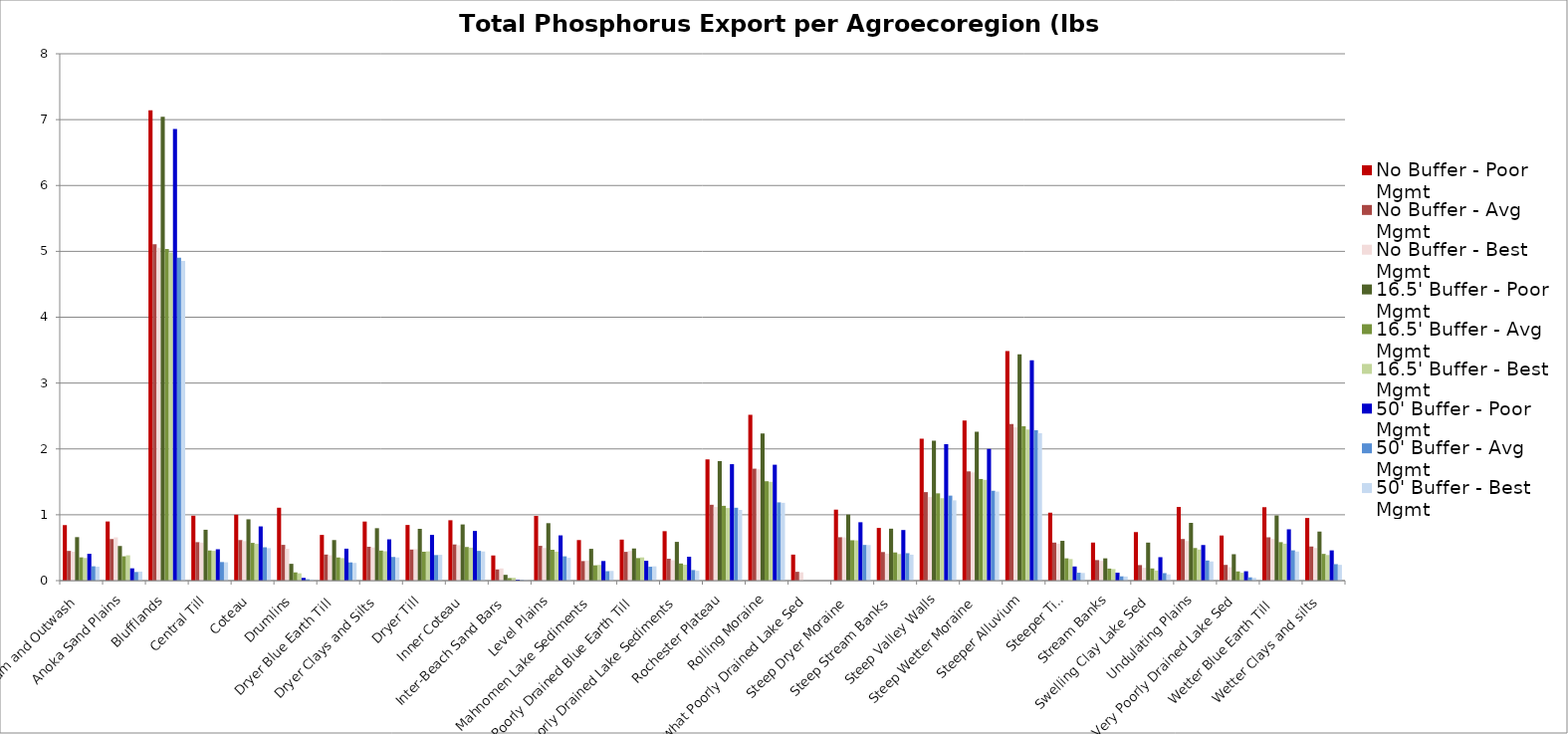
| Category | No Buffer - Poor Mgmt | No Buffer - Avg Mgmt | No Buffer - Best Mgmt | 16.5' Buffer - Poor Mgmt | 16.5' Buffer - Avg Mgmt | 16.5' Buffer - Best Mgmt | 50' Buffer - Poor Mgmt | 50' Buffer - Avg Mgmt | 50' Buffer - Best Mgmt |
|---|---|---|---|---|---|---|---|---|---|
| Alluvium and Outwash | 0.843 | 0.451 | 0.439 | 0.66 | 0.353 | 0.344 | 0.407 | 0.218 | 0.212 |
| Anoka Sand Plains | 0.898 | 0.631 | 0.657 | 0.526 | 0.37 | 0.385 | 0.187 | 0.131 | 0.137 |
| Blufflands | 7.141 | 5.107 | 5.054 | 7.042 | 5.036 | 4.984 | 6.859 | 4.905 | 4.855 |
| Central Till | 0.986 | 0.584 | 0.577 | 0.773 | 0.458 | 0.452 | 0.476 | 0.282 | 0.279 |
| Coteau | 1.001 | 0.616 | 0.6 | 0.931 | 0.573 | 0.558 | 0.823 | 0.507 | 0.494 |
| Drumlins | 1.107 | 0.543 | 0.483 | 0.255 | 0.125 | 0.111 | 0.042 | 0.021 | 0.018 |
| Dryer Blue Earth Till | 0.694 | 0.396 | 0.385 | 0.616 | 0.352 | 0.342 | 0.485 | 0.277 | 0.269 |
| Dryer Clays and Silts | 0.897 | 0.514 | 0.503 | 0.796 | 0.456 | 0.447 | 0.627 | 0.359 | 0.352 |
| Dryer Till | 0.845 | 0.472 | 0.477 | 0.786 | 0.439 | 0.444 | 0.695 | 0.388 | 0.392 |
| Inner Coteau | 0.917 | 0.549 | 0.538 | 0.853 | 0.511 | 0.501 | 0.754 | 0.452 | 0.443 |
| Inter-Beach Sand Bars | 0.382 | 0.17 | 0.185 | 0.088 | 0.039 | 0.043 | 0.015 | 0.006 | 0.007 |
| Level Plains | 0.983 | 0.528 | 0.496 | 0.873 | 0.469 | 0.44 | 0.687 | 0.369 | 0.347 |
| Mahnomen Lake Sediments | 0.616 | 0.297 | 0.304 | 0.483 | 0.233 | 0.238 | 0.298 | 0.144 | 0.147 |
| Poorly Drained Blue Earth Till | 0.623 | 0.437 | 0.45 | 0.488 | 0.342 | 0.353 | 0.301 | 0.211 | 0.217 |
| Poorly Drained Lake Sediments | 0.751 | 0.332 | 0.309 | 0.588 | 0.26 | 0.242 | 0.363 | 0.16 | 0.149 |
| Rochester Plateau | 1.841 | 1.152 | 1.118 | 1.815 | 1.136 | 1.103 | 1.768 | 1.107 | 1.074 |
| Rolling Moraine | 2.518 | 1.7 | 1.69 | 2.235 | 1.509 | 1.5 | 1.76 | 1.188 | 1.181 |
| Somewhat Poorly Drained Lake Sed | 0.395 | 0.134 | 0.126 | 0 | 0 | 0 | 0 | 0 | 0 |
| Steep Dryer Moraine | 1.078 | 0.659 | 0.657 | 1.003 | 0.613 | 0.611 | 0.887 | 0.542 | 0.54 |
| Steep Stream Banks | 0.8 | 0.434 | 0.41 | 0.789 | 0.428 | 0.404 | 0.768 | 0.417 | 0.394 |
| Steep Valley Walls | 2.156 | 1.344 | 1.269 | 2.126 | 1.325 | 1.251 | 2.071 | 1.291 | 1.219 |
| Steep Wetter Moraine | 2.431 | 1.659 | 1.644 | 2.262 | 1.543 | 1.529 | 2 | 1.365 | 1.352 |
| Steeper Alluvium | 3.485 | 2.378 | 2.329 | 3.437 | 2.345 | 2.297 | 3.347 | 2.284 | 2.237 |
| Steeper Till | 1.032 | 0.578 | 0.559 | 0.604 | 0.338 | 0.327 | 0.215 | 0.12 | 0.116 |
| Stream Banks | 0.578 | 0.312 | 0.3 | 0.338 | 0.183 | 0.176 | 0.12 | 0.065 | 0.062 |
| Swelling Clay Lake Sed | 0.737 | 0.236 | 0.195 | 0.577 | 0.185 | 0.153 | 0.356 | 0.114 | 0.094 |
| Undulating Plains | 1.119 | 0.632 | 0.602 | 0.877 | 0.495 | 0.472 | 0.541 | 0.305 | 0.291 |
| Very Poorly Drained Lake Sed | 0.685 | 0.239 | 0.204 | 0.401 | 0.14 | 0.119 | 0.142 | 0.05 | 0.042 |
| Wetter Blue Earth Till  | 1.115 | 0.658 | 0.632 | 0.99 | 0.584 | 0.561 | 0.779 | 0.46 | 0.442 |
| Wetter Clays and silts | 0.951 | 0.518 | 0.496 | 0.745 | 0.406 | 0.389 | 0.46 | 0.25 | 0.24 |